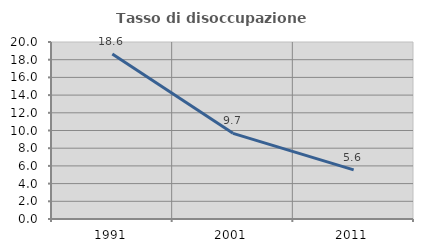
| Category | Tasso di disoccupazione giovanile  |
|---|---|
| 1991.0 | 18.644 |
| 2001.0 | 9.677 |
| 2011.0 | 5.556 |